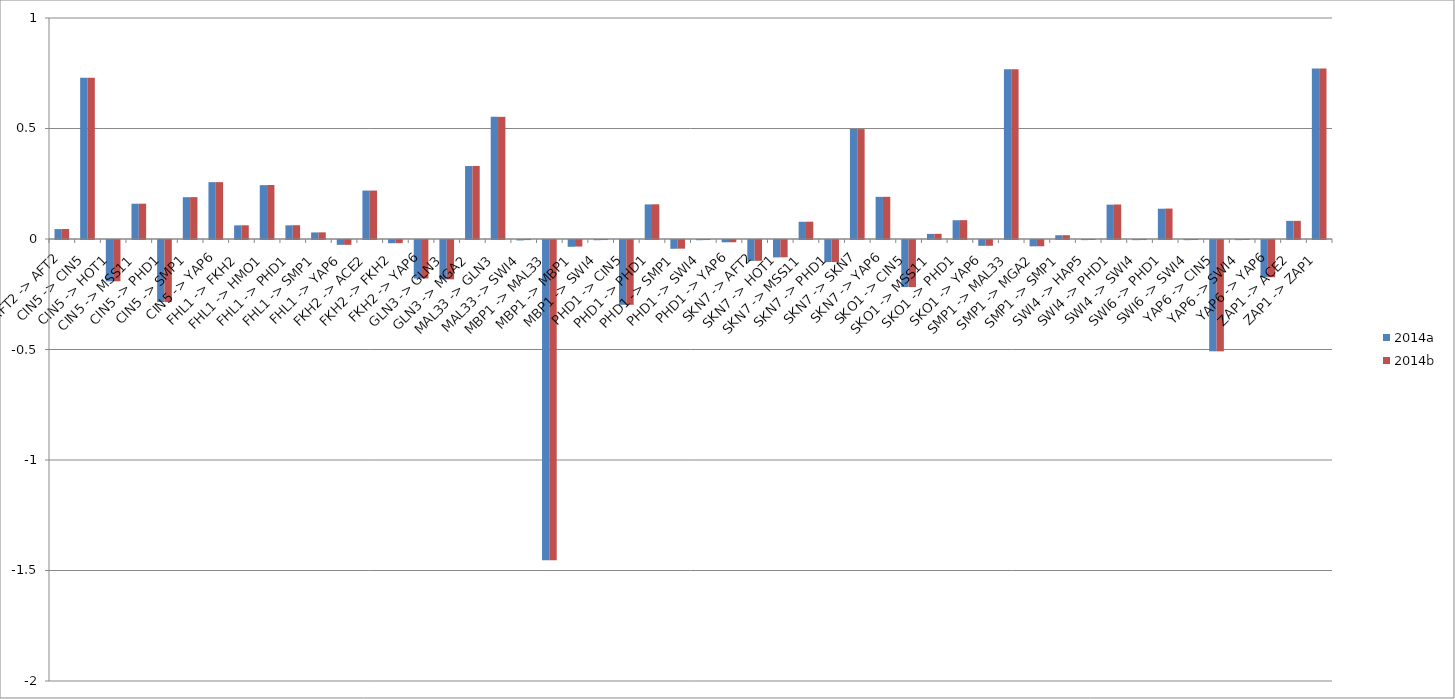
| Category | 2014a | 2014b |
|---|---|---|
| AFT2 -> AFT2 | 0.045 | 0.045 |
| CIN5 -> CIN5 | 0.73 | 0.73 |
| CIN5 -> HOT1 | -0.187 | -0.187 |
| CIN5 -> MSS11 | 0.16 | 0.16 |
| CIN5 -> PHD1 | -0.281 | -0.281 |
| CIN5 -> SMP1 | 0.189 | 0.189 |
| CIN5 -> YAP6 | 0.257 | 0.257 |
| FHL1 -> FKH2 | 0.062 | 0.062 |
| FHL1 -> HMO1 | 0.244 | 0.244 |
| FHL1 -> PHD1 | 0.062 | 0.062 |
| FHL1 -> SMP1 | 0.03 | 0.03 |
| FHL1 -> YAP6 | -0.022 | -0.022 |
| FKH2 -> ACE2 | 0.219 | 0.219 |
| FKH2 -> FKH2 | -0.015 | -0.014 |
| FKH2 -> YAP6 | -0.174 | -0.174 |
| GLN3 -> GLN3 | -0.178 | -0.178 |
| GLN3 -> MGA2 | 0.33 | 0.33 |
| MAL33 -> GLN3 | 0.553 | 0.553 |
| MAL33 -> SWI4 | -0.002 | 0 |
| MBP1 -> MAL33 | -1.449 | -1.449 |
| MBP1 -> MBP1 | -0.031 | -0.03 |
| MBP1 -> SWI4 | -0.001 | 0 |
| PHD1 -> CIN5 | -0.293 | -0.293 |
| PHD1 -> PHD1 | 0.157 | 0.157 |
| PHD1 -> SMP1 | -0.04 | -0.039 |
| PHD1 -> SWI4 | -0.001 | 0 |
| PHD1 -> YAP6 | -0.01 | -0.01 |
| SKN7 -> AFT2 | -0.095 | -0.094 |
| SKN7 -> HOT1 | -0.079 | -0.078 |
| SKN7 -> MSS11 | 0.078 | 0.078 |
| SKN7 -> PHD1 | -0.1 | -0.1 |
| SKN7 -> SKN7 | 0.497 | 0.497 |
| SKN7 -> YAP6 | 0.191 | 0.191 |
| SKO1 -> CIN5 | -0.213 | -0.213 |
| SKO1 -> MSS11 | 0.023 | 0.024 |
| SKO1 -> PHD1 | 0.085 | 0.085 |
| SKO1 -> YAP6 | -0.026 | -0.026 |
| SMP1 -> MAL33 | 0.768 | 0.768 |
| SMP1 -> MGA2 | -0.029 | -0.028 |
| SMP1 -> SMP1 | 0.017 | 0.017 |
| SWI4 -> HAP5 | -0.001 | 0 |
| SWI4 -> PHD1 | 0.156 | 0.156 |
| SWI4 -> SWI4 | -0.001 | 0 |
| SWI6 -> PHD1 | 0.137 | 0.138 |
| SWI6 -> SWI4 | -0.001 | 0 |
| YAP6 -> CIN5 | -0.504 | -0.504 |
| YAP6 -> SWI4 | -0.001 | 0 |
| YAP6 -> YAP6 | -0.169 | -0.169 |
| ZAP1 -> ACE2 | 0.082 | 0.082 |
| ZAP1 -> ZAP1 | 0.772 | 0.772 |